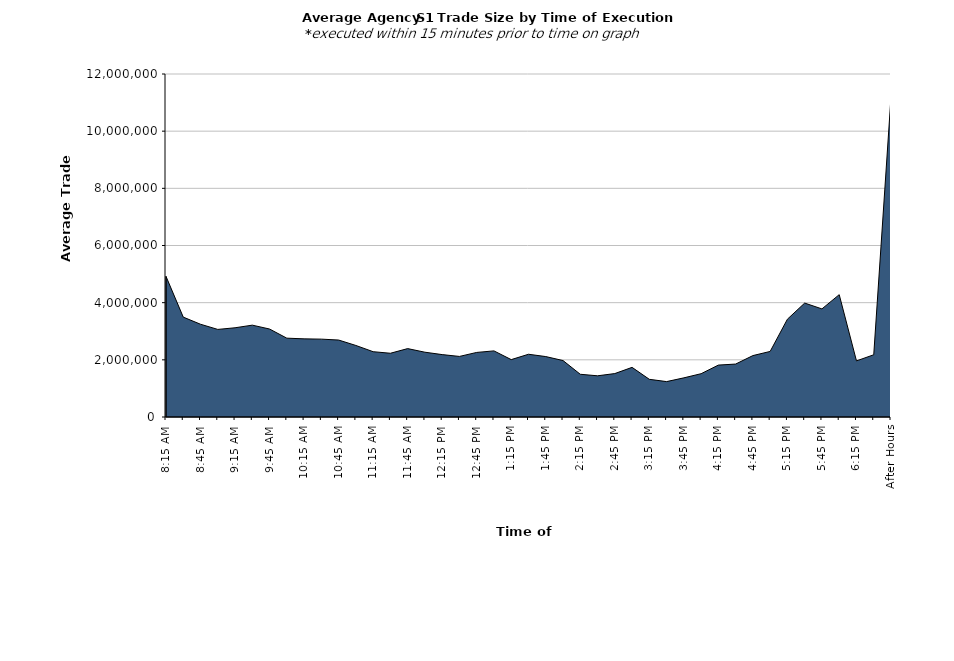
| Category | Series 0 |
|---|---|
| 8:15 AM | 4920296.877 |
| 8:30 AM | 3494254.38 |
| 8:45 AM | 3245063.757 |
| 9:00 AM | 3064007.168 |
| 9:15 AM | 3121721.903 |
| 9:30 AM | 3213619.701 |
| 9:45 AM | 3077629.719 |
| 10:00 AM | 2758319.424 |
| 10:15 AM | 2733986.721 |
| 10:30 AM | 2724227.289 |
| 10:45 AM | 2692320.58 |
| 11:00 AM | 2502773.586 |
| 11:15 AM | 2284896.504 |
| 11:30 AM | 2230164.5 |
| 11:45 AM | 2392996.91 |
| 12:00 PM | 2266558.57 |
| 12:15 PM | 2183185.346 |
| 12:30 PM | 2119208.514 |
| 12:45 PM | 2259241.599 |
| 1:00 PM | 2313184.444 |
| 1:15 PM | 2007812.403 |
| 1:30 PM | 2194832.972 |
| 1:45 PM | 2114162.917 |
| 2:00 PM | 1975000.948 |
| 2:15 PM | 1494914.243 |
| 2:30 PM | 1441310.553 |
| 2:45 PM | 1519214.281 |
| 3:00 PM | 1736255.895 |
| 3:15 PM | 1318304.397 |
| 3:30 PM | 1238454.939 |
| 3:45 PM | 1369441.982 |
| 4:00 PM | 1514770.901 |
| 4:15 PM | 1815879.236 |
| 4:30 PM | 1852310.7 |
| 4:45 PM | 2148577.382 |
| 5:00 PM | 2294134.442 |
| 5:15 PM | 3422835.635 |
| 5:30 PM | 3985717.172 |
| 5:45 PM | 3781901.784 |
| 6:00 PM | 4280087.599 |
| 6:15 PM | 1962685.714 |
| 6:30 PM | 2177762.712 |
| After Hours | 11204639.7 |